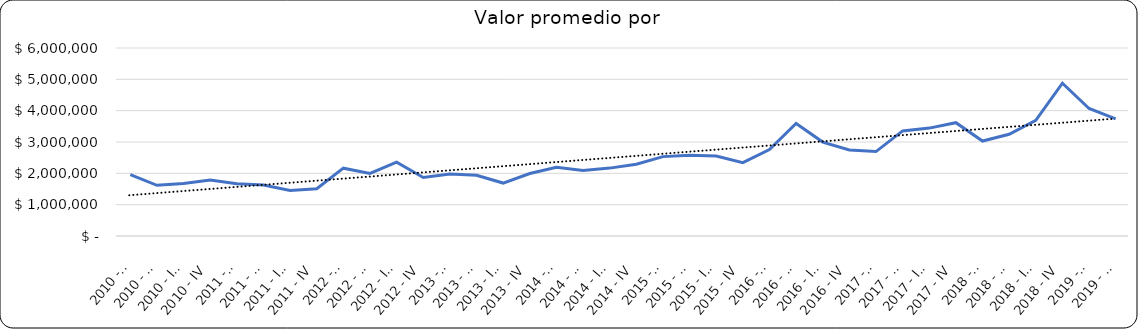
| Category | Valor m2 en Bogotá por sectores |
|---|---|
| 2010 - I | 1961904.762 |
| 2010 - II | 1616666.667 |
| 2010 - III | 1676190.476 |
| 2010 - IV | 1785714.286 |
| 2011 - I | 1666666.667 |
| 2011 - II | 1628019.324 |
| 2011 - III | 1449275.362 |
| 2011 - IV | 1509661.836 |
| 2012 - I | 2164625.143 |
| 2012 - II | 1997619.048 |
| 2012 - III | 2354761.905 |
| 2012 - IV | 1867619.048 |
| 2013 - I | 1975915.385 |
| 2013 - II | 1938461.538 |
| 2013 - III | 1689743.59 |
| 2013 - IV | 1994871.795 |
| 2014 - I | 2193627.451 |
| 2014 - II | 2088235.294 |
| 2014 - III | 2166666.667 |
| 2014 - IV | 2291666.667 |
| 2015 - I | 2533333.333 |
| 2015 - II | 2579487.179 |
| 2015 - III | 2551282.051 |
| 2015 - IV | 2340105.128 |
| 2016 - I | 2757352.941 |
| 2016 - II | 3589552.239 |
| 2016 - III | 2997222.222 |
| 2016 - IV | 2747395.833 |
| 2017 - I | 2694444.444 |
| 2017 - II | 3354330.709 |
| 2017 - III | 3443396.226 |
| 2017 - IV | 3615384.615 |
| 2018 - I | 3030303.03 |
| 2018 - II | 3247863.248 |
| 2018 - III | 3692308 |
| 2018 - IV | 4877328 |
| 2019 - I | 4068933 |
| 2019 - II | 3740458 |